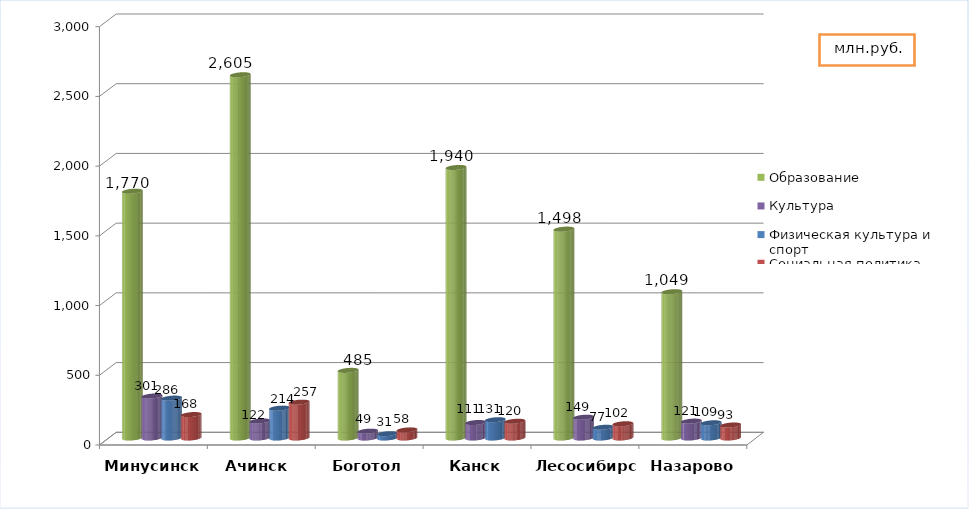
| Category | Образование | Культура | Физическая культура и спорт | Социальная политика |
|---|---|---|---|---|
| Минусинск | 1770 | 301 | 286 | 168 |
| Ачинск  | 2605 | 122 | 214 | 257 |
| Боготол | 485 | 49 | 31 | 58 |
| Канск | 1940 | 111 | 131 | 120 |
| Лесосибирск | 1498 | 149 | 77 | 102 |
| Назарово | 1049 | 121 | 109 | 93 |